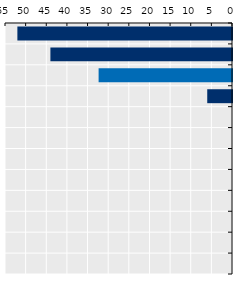
| Category | Length in weeks |
|---|---|
| Korea | 52 |
| Japan | 44 |
| OECD average | 32.319 |
| Australia | 6 |
| New Zealand | 0 |
| Viet Nam* | 0 |
| Singapore | 0 |
| Mongolia | 0 |
| Indonesia* | 0 |
| Thailand | 0 |
| China* | 0 |
| Malaysia | 0 |